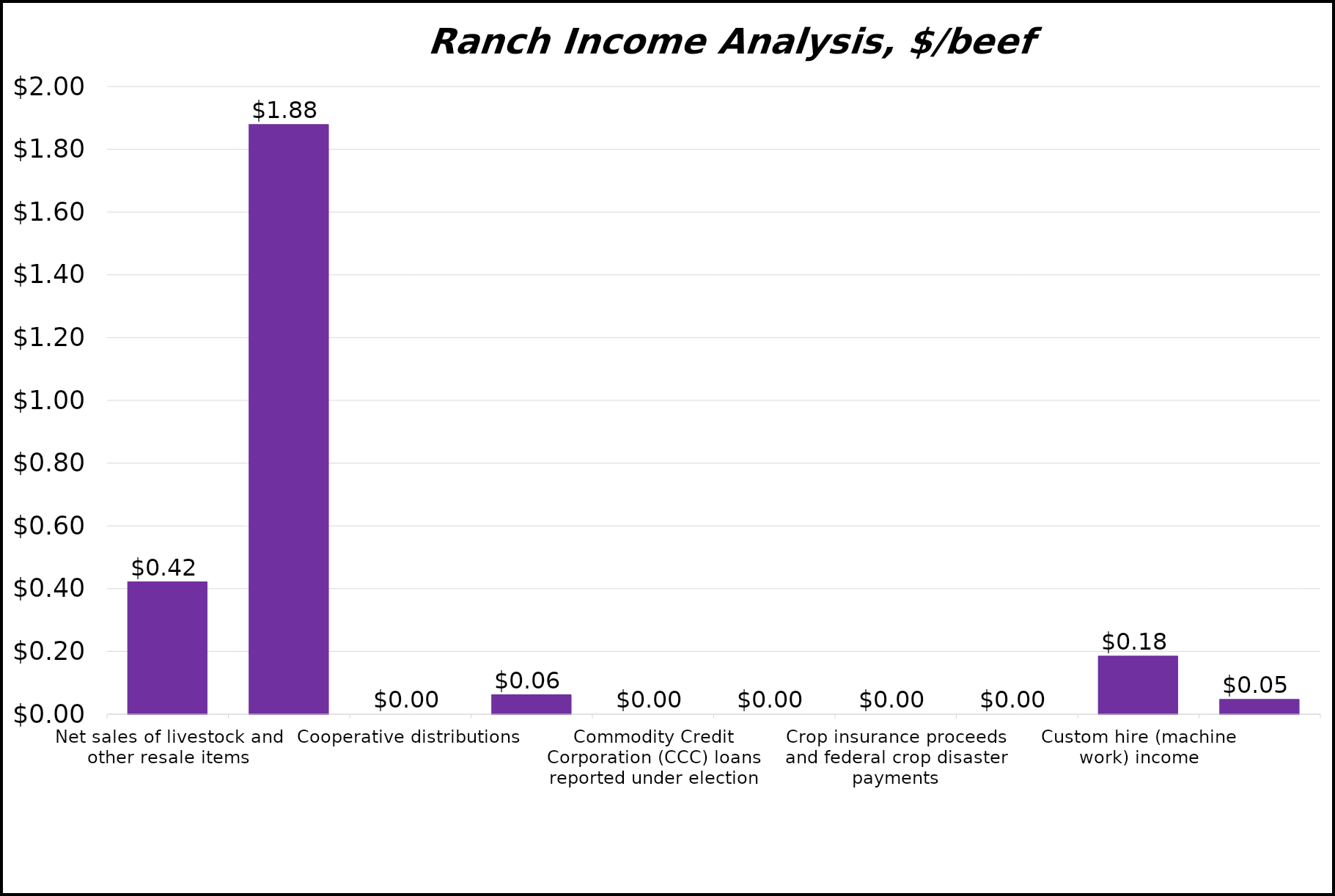
| Category | $/beef cow/day |
|---|---|
| Net sales of livestock and other resale items | 0.421 |
| Sales of livestock, produce, grains, and other products you raised | 1.878 |
| Cooperative distributions | 0 |
| Agricultural program payments | 0.061 |
| Commodity Credit Corporation (CCC) loans reported under election | 0 |
| Commodity Credit Corporation (CCC) loans forfeited | 0 |
| Crop insurance proceeds and federal crop disaster payments | 0 |
| Crop insurance proceeds and federal crop disaster payments deferred | 0 |
| Custom hire (machine work) income | 0.184 |
| Other income | 0.046 |